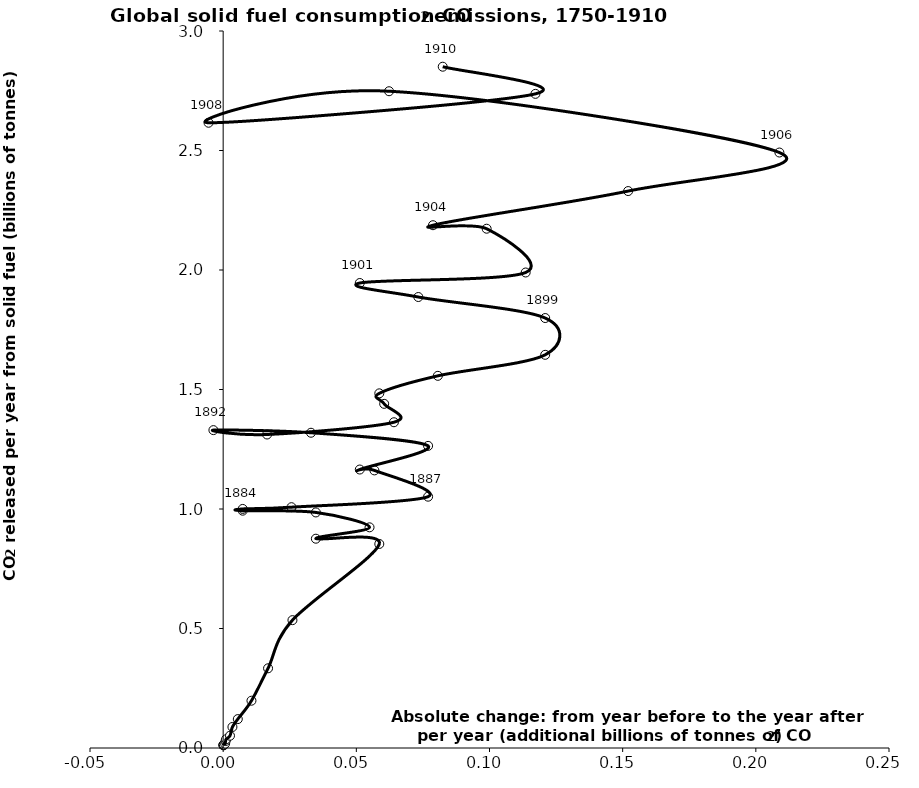
| Category | Series 0 |
|---|---|
| 0.00012213333333333328 | 0.011 |
| 0.00012213333333333328 | 0.012 |
| 0.0001221333333333334 | 0.013 |
| 0.0002442666666666667 | 0.015 |
| 0.0007328 | 0.018 |
| 0.0009159999999999999 | 0.029 |
| 0.0010992 | 0.037 |
| 0.0025648 | 0.051 |
| 0.0034808000000000005 | 0.088 |
| 0.005496 | 0.121 |
| 0.010625599999999999 | 0.198 |
| 0.0168544 | 0.333 |
| 0.026014400000000003 | 0.535 |
| 0.05862400000000001 | 0.854 |
| 0.034808000000000006 | 0.876 |
| 0.05496000000000001 | 0.923 |
| 0.03480800000000006 | 0.986 |
| 0.007328000000000001 | 0.993 |
| 0.007327999999999946 | 1 |
| 0.025648000000000004 | 1.008 |
| 0.07694400000000001 | 1.052 |
| 0.056791999999999954 | 1.161 |
| 0.0512959999999999 | 1.165 |
| 0.07694400000000001 | 1.264 |
| 0.032976000000000116 | 1.319 |
| -0.0036640000000000006 | 1.33 |
| 0.016487999999999947 | 1.312 |
| 0.06412000000000007 | 1.363 |
| 0.060456000000000065 | 1.44 |
| 0.0586239999999999 | 1.484 |
| 0.08060800000000001 | 1.557 |
| 0.12091200000000002 | 1.645 |
| 0.12091200000000002 | 1.799 |
| 0.07328000000000012 | 1.887 |
| 0.05129600000000001 | 1.946 |
| 0.11358399999999991 | 1.99 |
| 0.0989279999999999 | 2.173 |
| 0.07877599999999996 | 2.187 |
| 0.1520560000000002 | 2.33 |
| 0.20884800000000014 | 2.492 |
| 0.0622879999999999 | 2.748 |
| -0.005496000000000167 | 2.616 |
| 0.11724800000000002 | 2.737 |
| 0.08244000000000029 | 2.851 |